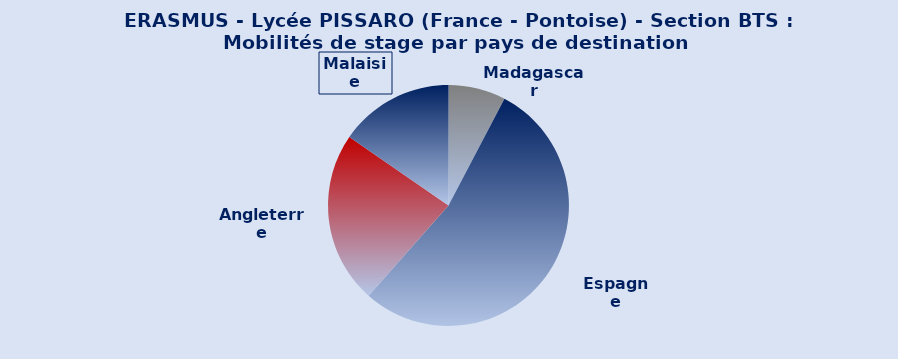
| Category | Doné |
|---|---|
| Madagascar | 1 |
| Espagne | 7 |
| Angleterre | 3 |
| Malaisie | 2 |